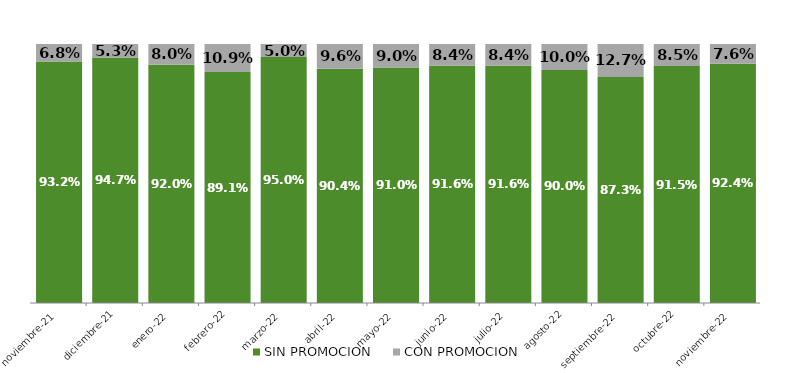
| Category | SIN PROMOCION   | CON PROMOCION   |
|---|---|---|
| 2021-11-01 | 0.932 | 0.068 |
| 2021-12-01 | 0.947 | 0.053 |
| 2022-01-01 | 0.92 | 0.08 |
| 2022-02-01 | 0.891 | 0.109 |
| 2022-03-01 | 0.95 | 0.05 |
| 2022-04-01 | 0.904 | 0.096 |
| 2022-05-01 | 0.91 | 0.09 |
| 2022-06-01 | 0.916 | 0.084 |
| 2022-07-01 | 0.916 | 0.084 |
| 2022-08-01 | 0.9 | 0.1 |
| 2022-09-01 | 0.873 | 0.127 |
| 2022-10-01 | 0.915 | 0.085 |
| 2022-11-01 | 0.924 | 0.076 |